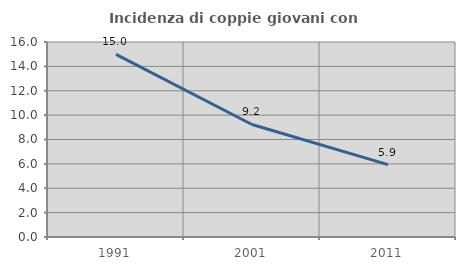
| Category | Incidenza di coppie giovani con figli |
|---|---|
| 1991.0 | 14.979 |
| 2001.0 | 9.234 |
| 2011.0 | 5.941 |